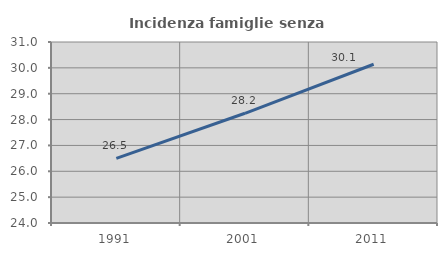
| Category | Incidenza famiglie senza nuclei |
|---|---|
| 1991.0 | 26.5 |
| 2001.0 | 28.243 |
| 2011.0 | 30.139 |